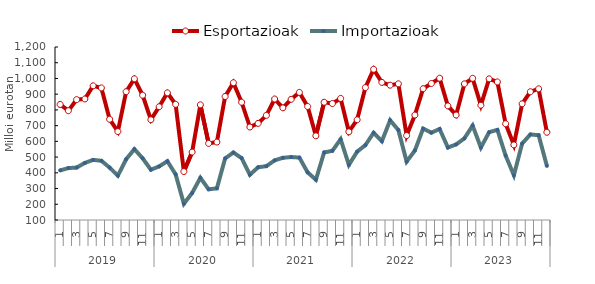
| Category | Esportazioak | Importazioak |
|---|---|---|
| 0 | 834.66 | 415.3 |
| 1 | 795.13 | 430.06 |
| 2 | 865.46 | 433.45 |
| 3 | 869.5 | 463.12 |
| 4 | 953.24 | 482.16 |
| 5 | 939.76 | 476.54 |
| 6 | 740.64 | 433.25 |
| 7 | 662.58 | 382.11 |
| 8 | 915.76 | 486.24 |
| 9 | 997.65 | 550.58 |
| 10 | 893.45 | 492.44 |
| 11 | 737.54 | 419.75 |
| 12 | 820.04 | 440.66 |
| 13 | 908.52 | 473.98 |
| 14 | 835.73 | 390.31 |
| 15 | 408.13 | 202.94 |
| 16 | 531.96 | 271.71 |
| 17 | 832.33 | 368.39 |
| 18 | 587.05 | 295.03 |
| 19 | 595.63 | 301.5 |
| 20 | 885.4 | 491.38 |
| 21 | 972.76 | 529.19 |
| 22 | 848.92 | 493.49 |
| 23 | 691.19 | 387.83 |
| 24 | 714.33 | 435.43 |
| 25 | 765.4 | 442.33 |
| 26 | 869.24 | 479.14 |
| 27 | 813.22 | 495.48 |
| 28 | 867.35 | 500.32 |
| 29 | 911.28 | 496.85 |
| 30 | 821.76 | 402.8 |
| 31 | 635.35 | 356.09 |
| 32 | 848.61 | 529.58 |
| 33 | 840.41 | 539.96 |
| 34 | 873.11 | 613.56 |
| 35 | 660.72 | 450.58 |
| 36 | 737.34 | 534.48 |
| 37 | 941.96 | 575.97 |
| 38 | 1058.34 | 654.67 |
| 39 | 974.82 | 601.12 |
| 40 | 957.1 | 734.13 |
| 41 | 965.9 | 671.83 |
| 42 | 636.85 | 471.02 |
| 43 | 767.27 | 541.81 |
| 44 | 934.73 | 681.1 |
| 45 | 968.02 | 655.21 |
| 46 | 1001.7 | 678.68 |
| 47 | 825.45 | 560.8 |
| 48 | 767.51 | 580.55 |
| 49 | 965.45 | 618.85 |
| 50 | 1000.93 | 700.22 |
| 51 | 829.7 | 560.86 |
| 52 | 997.57 | 658.38 |
| 53 | 977.78 | 673.17 |
| 54 | 712.04 | 509.84 |
| 55 | 577.51 | 384.39 |
| 56 | 838.89 | 586.07 |
| 57 | 915.39 | 643.84 |
| 58 | 934.04 | 639.04 |
| 59 | 657.82 | 444.2 |